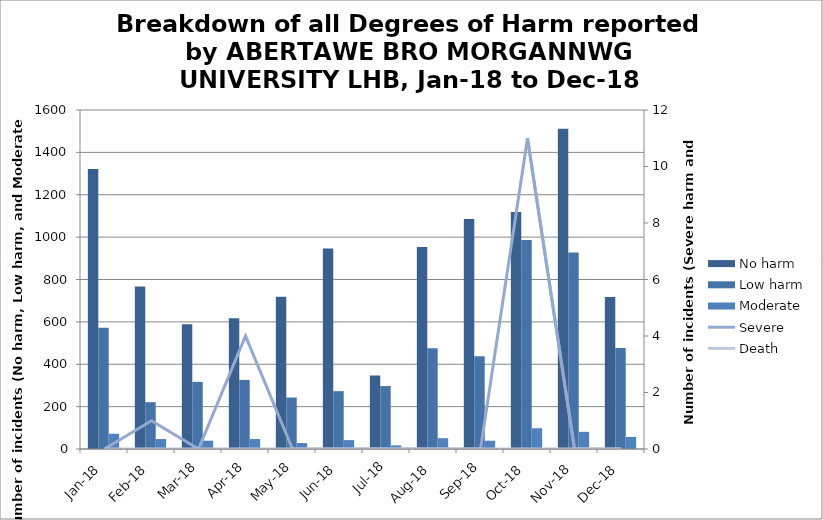
| Category | No harm | Low harm | Moderate |
|---|---|---|---|
| Jan-18 | 1321 | 572 | 72 |
| Feb-18 | 767 | 221 | 47 |
| Mar-18 | 589 | 317 | 39 |
| Apr-18 | 617 | 326 | 47 |
| May-18 | 718 | 243 | 28 |
| Jun-18 | 946 | 273 | 42 |
| Jul-18 | 347 | 297 | 17 |
| Aug-18 | 953 | 475 | 51 |
| Sep-18 | 1085 | 438 | 39 |
| Oct-18 | 1119 | 986 | 98 |
| Nov-18 | 1511 | 927 | 81 |
| Dec-18 | 717 | 477 | 57 |